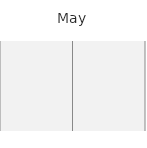
| Category | 1 | Fill 1 | 2 | Fill 2 | 3 | Fill 3 | 4 | Fill 4 | 5 | Fill 5 | 6 | Fill 6 | 7 | Fill 7 | 8 | Fill 8 | 9 | Fill 9 | 10 | Fill 10 | 11 | Fill 11 | 12 | Fill 12 | 13 | Fill 13 | 14 | Fill 14 | 15 | Fill 15 | 16 | Fill 16 | 17 | Fill 17 | 18 | Fill 18 | 19 | Fill 19 | 20 | Fill 20 | 21 | Fill 21 | 22 | Fill 22 | 23 | Fill 23 | 24 | Fill 24 | 25 | Fill 25 | 26 | Fill 26 | 27 | Fill 27 | 28 | Fill 28 | 29 | Fill 29 | 30 | Fill 30 | 31 | Fill 31 |
|---|---|---|---|---|---|---|---|---|---|---|---|---|---|---|---|---|---|---|---|---|---|---|---|---|---|---|---|---|---|---|---|---|---|---|---|---|---|---|---|---|---|---|---|---|---|---|---|---|---|---|---|---|---|---|---|---|---|---|---|---|---|---|
| R | 0 | 1 | 0 | 1 | 0 | 1 | 0 | 1 | 0 | 1 | 0 | 1 | 0 | 1 | 0 | 1 | 0 | 1 | 0 | 1 | 0 | 1 | 0 | 1 | 0 | 1 | 0 | 1 | 0 | 1 | 0 | 1 | 0 | 1 | 0 | 1 | 0 | 1 | 0 | 1 | 0 | 1 | 0 | 1 | 0 | 1 | 0 | 1 | 0 | 1 | 0 | 1 | 0 | 1 | 0 | 1 | 0 | 1 | 0 | 1 | 0 | 1 |
| M | 0 | 1 | 0 | 1 | 0 | 1 | 0 | 1 | 0 | 1 | 0 | 1 | 0 | 1 | 0 | 1 | 0 | 1 | 0 | 1 | 0 | 1 | 0 | 1 | 0 | 1 | 0 | 1 | 0 | 1 | 0 | 1 | 0 | 1 | 0 | 1 | 0 | 1 | 0 | 1 | 0 | 1 | 0 | 1 | 0 | 1 | 0 | 1 | 0 | 1 | 0 | 1 | 0 | 1 | 0 | 1 | 0 | 1 | 0 | 1 | 0 | 1 |
| U1 | 0 | 1 | 0 | 1 | 0 | 1 | 0 | 1 | 0 | 1 | 0 | 1 | 0 | 1 | 0 | 1 | 0 | 1 | 0 | 1 | 0 | 1 | 0 | 1 | 0 | 1 | 0 | 1 | 0 | 1 | 0 | 1 | 0 | 1 | 0 | 1 | 0 | 1 | 0 | 1 | 0 | 1 | 0 | 1 | 0 | 1 | 0 | 1 | 0 | 1 | 0 | 1 | 0 | 1 | 0 | 1 | 0 | 1 | 0 | 1 | 0 | 1 |
| U2 | 0 | 1 | 0 | 1 | 0 | 1 | 0 | 1 | 0 | 1 | 0 | 1 | 0 | 1 | 0 | 1 | 0 | 1 | 0 | 1 | 0 | 1 | 0 | 1 | 0 | 1 | 0 | 1 | 0 | 1 | 0 | 1 | 0 | 1 | 0 | 1 | 0 | 1 | 0 | 1 | 0 | 1 | 0 | 1 | 0 | 1 | 0 | 1 | 0 | 1 | 0 | 1 | 0 | 1 | 0 | 1 | 0 | 1 | 0 | 1 | 0 | 1 |
| U3 | 0 | 1 | 0 | 1 | 0 | 1 | 0 | 1 | 0 | 1 | 0 | 1 | 0 | 1 | 0 | 1 | 0 | 1 | 0 | 1 | 0 | 1 | 0 | 1 | 0 | 1 | 0 | 1 | 0 | 1 | 0 | 1 | 0 | 1 | 0 | 1 | 0 | 1 | 0 | 1 | 0 | 1 | 0 | 1 | 0 | 1 | 0 | 1 | 0 | 1 | 0 | 1 | 0 | 1 | 0 | 1 | 0 | 1 | 0 | 1 | 0 | 1 |